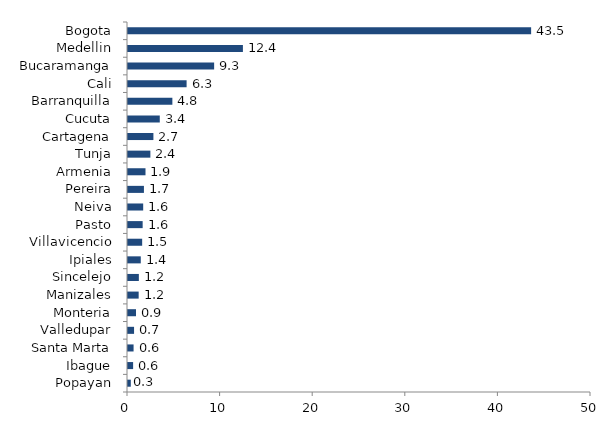
| Category | Series 0 |
|---|---|
| Popayan | 0.303 |
| Ibague | 0.553 |
| Santa Marta | 0.602 |
| Valledupar | 0.655 |
| Monteria | 0.865 |
| Manizales | 1.152 |
| Sincelejo | 1.172 |
| Ipiales | 1.379 |
| Villavicencio | 1.53 |
| Pasto | 1.583 |
| Neiva | 1.64 |
| Pereira | 1.72 |
| Armenia | 1.89 |
| Tunja | 2.416 |
| Cartagena | 2.744 |
| Cucuta | 3.431 |
| Barranquilla | 4.791 |
| Cali | 6.329 |
| Bucaramanga | 9.302 |
| Medellin | 12.409 |
| Bogota | 43.534 |